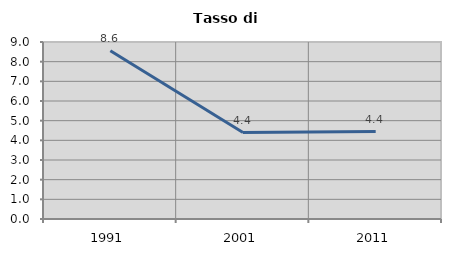
| Category | Tasso di disoccupazione   |
|---|---|
| 1991.0 | 8.555 |
| 2001.0 | 4.394 |
| 2011.0 | 4.447 |